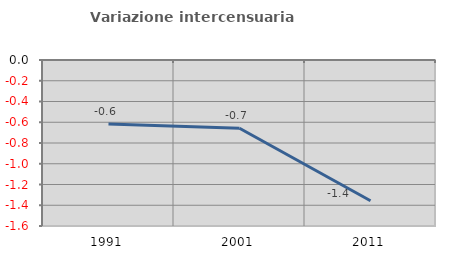
| Category | Variazione intercensuaria annua |
|---|---|
| 1991.0 | -0.617 |
| 2001.0 | -0.658 |
| 2011.0 | -1.357 |